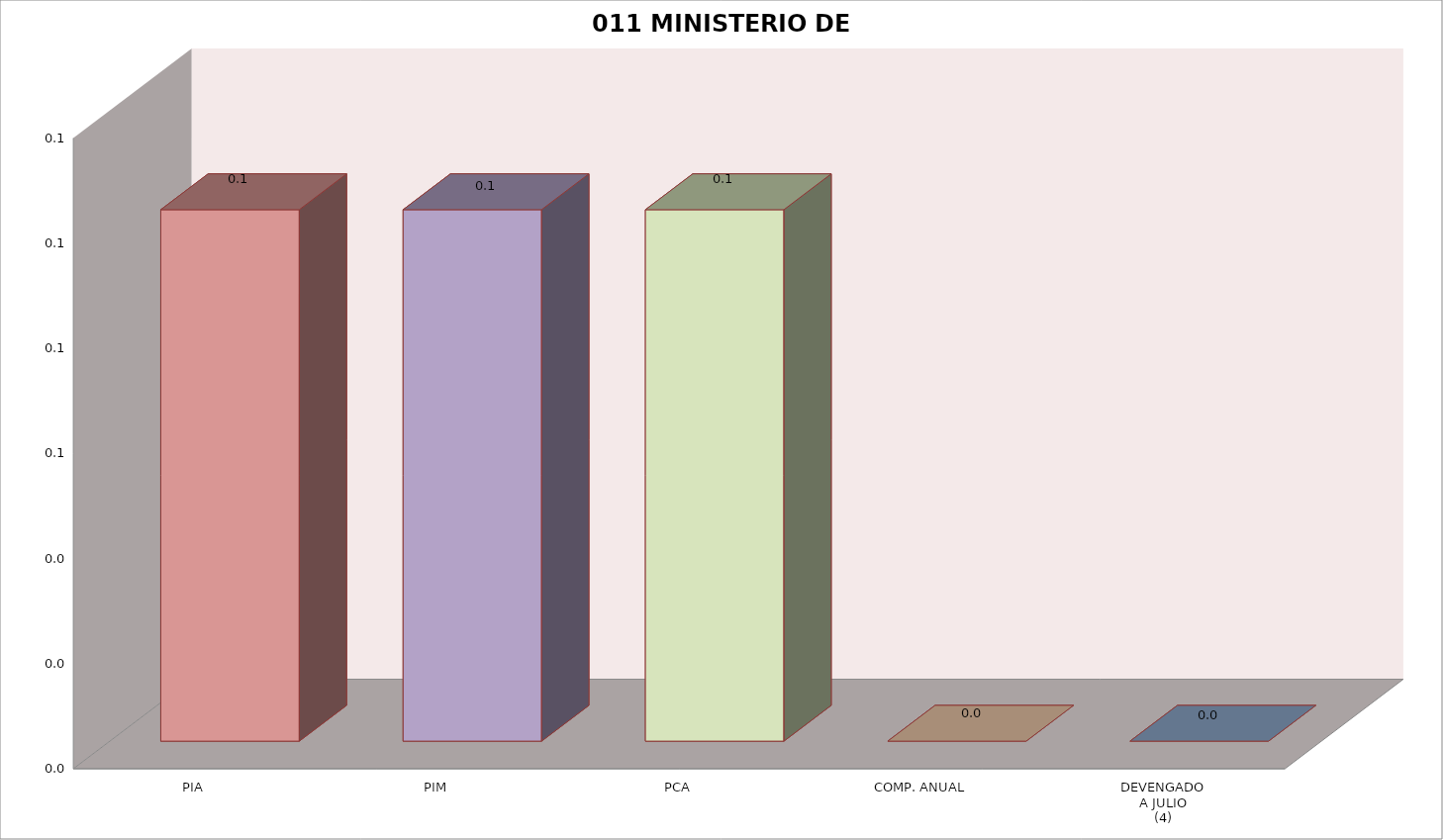
| Category | 011 MINISTERIO DE SALUD |
|---|---|
| PIA | 0.101 |
| PIM | 0.101 |
| PCA | 0.101 |
| COMP. ANUAL | 0 |
| DEVENGADO
A JULIO
(4) | 0 |